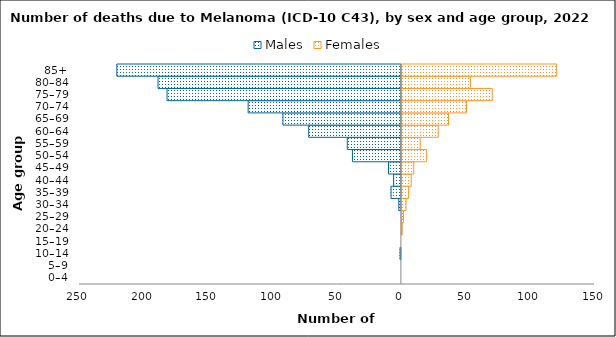
| Category | Males | Females |
|---|---|---|
| 0–4 | 0 | 0 |
| 5–9 | 0 | 0 |
| 10–14 | -1 | 0 |
| 15–19 | 0 | 0 |
| 20–24 | 0 | 1 |
| 25–29 | 0 | 2 |
| 30–34 | -2 | 4 |
| 35–39 | -8 | 6 |
| 40–44 | -6 | 8 |
| 45–49 | -10 | 10 |
| 50–54 | -38 | 20 |
| 55–59 | -42 | 15 |
| 60–64 | -72 | 29 |
| 65–69 | -92 | 37 |
| 70–74 | -119 | 51 |
| 75–79 | -182 | 71 |
| 80–84 | -189 | 54 |
| 85+ | -221 | 121 |